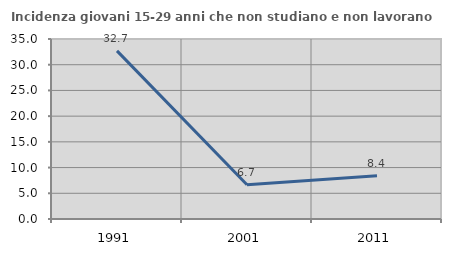
| Category | Incidenza giovani 15-29 anni che non studiano e non lavorano  |
|---|---|
| 1991.0 | 32.689 |
| 2001.0 | 6.667 |
| 2011.0 | 8.421 |